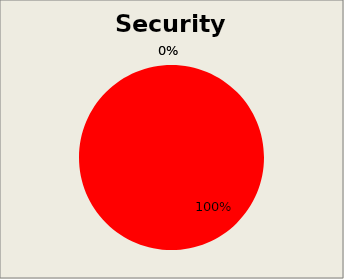
| Category | Series 0 |
|---|---|
| 0 | 0 |
| 1 | 21 |
| 2 | 0 |